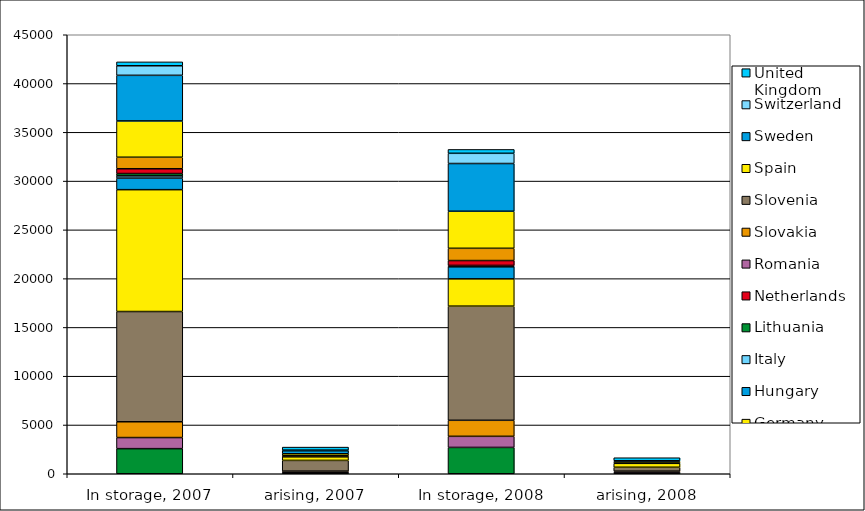
| Category | Belgium | Bulgaria | Czech Republic | Finland | France | Germany | Hungary | Italy | Lithuania | Netherlands | Romania | Slovakia | Slovenia | Spain | Sweden | Switzerland | United Kingdom |
|---|---|---|---|---|---|---|---|---|---|---|---|---|---|---|---|---|---|
| In storage, 2007 | 2573 | 0 | 1138 | 1618 | 11300 | 12492 | 1185 | 230 | 237 | 492 | 0 | 1180 | 0 | 3721 | 4675 | 980 | 398 |
| arising, 2007 | 96 | 0 | 105 | 67 | 1100 | 370 | 47 | 0 | 0 | 8 | 0 | 49 | 0 | 207 | 310 | 63 | 309 |
| In storage, 2008 | 2699 | 0 | 1138 | 1643 | 11700 | 2800 | 1233 | 143 | 0 | 500 | 0 | 1255 | 0 | 3797 | 4893 | 1046 | 398 |
| arising, 2008 | 125 | 0 | 79 | 63 | 400 | 400 | 48 | 0 | 0 | 8 | 0 | 75 | 0 | 76 | 0 | 60 | 309 |